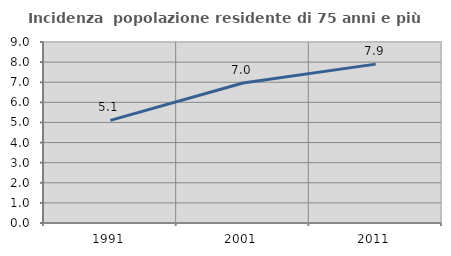
| Category | Incidenza  popolazione residente di 75 anni e più |
|---|---|
| 1991.0 | 5.105 |
| 2001.0 | 6.96 |
| 2011.0 | 7.9 |